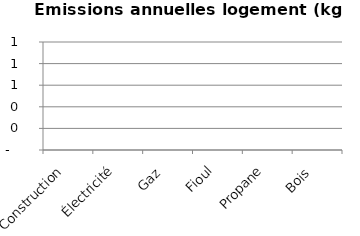
| Category | Series 0 |
|---|---|
| Construction | 0 |
| Électricité | 0 |
| Gaz  | 0 |
| Fioul | 0 |
| Propane | 0 |
| Bois  | 0 |